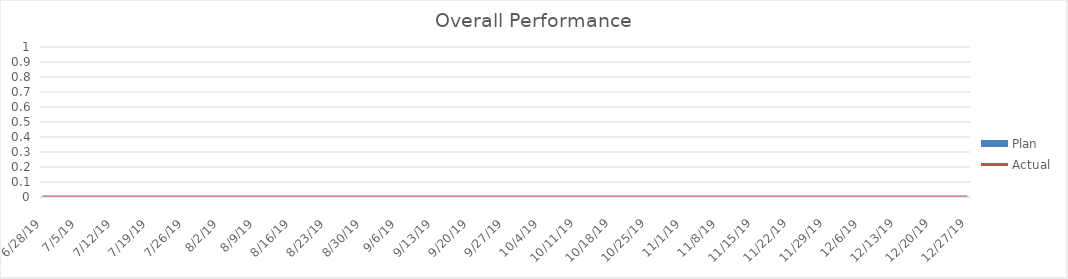
| Category | Actual |
|---|---|
| 6/28/19 | 0 |
| 7/5/19 | 0 |
| 7/12/19 | 0 |
| 7/19/19 | 0 |
| 7/26/19 | 0 |
| 8/2/19 | 0 |
| 8/9/19 | 0 |
| 8/16/19 | 0 |
| 8/23/19 | 0 |
| 8/30/19 | 0 |
| 9/6/19 | 0 |
| 9/13/19 | 0 |
| 9/20/19 | 0 |
| 9/27/19 | 0 |
| 10/4/19 | 0 |
| 10/11/19 | 0 |
| 10/18/19 | 0 |
| 10/25/19 | 0 |
| 11/1/19 | 0 |
| 11/8/19 | 0 |
| 11/15/19 | 0 |
| 11/22/19 | 0 |
| 11/29/19 | 0 |
| 12/6/19 | 0 |
| 12/13/19 | 0 |
| 12/20/19 | 0 |
| 12/27/19 | 0 |